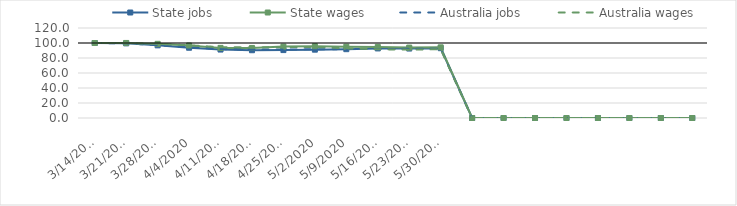
| Category | State jobs | State wages | Australia jobs | Australia wages |
|---|---|---|---|---|
| 14/03/2020 | 100 | 100 | 100 | 100 |
| 21/03/2020 | 99.502 | 100.082 | 99.552 | 99.902 |
| 28/03/2020 | 96.868 | 98.901 | 97.088 | 98.771 |
| 04/04/2020 | 93.669 | 96.728 | 94.15 | 97.007 |
| 11/04/2020 | 91.26 | 93.498 | 91.933 | 94.434 |
| 18/04/2020 | 90.36 | 93.376 | 91.108 | 94.115 |
| 25/04/2020 | 90.549 | 95.219 | 91.306 | 94.452 |
| 02/05/2020 | 91.109 | 95.774 | 91.63 | 94.778 |
| 09/05/2020 | 91.757 | 95.087 | 91.91 | 92.892 |
| 16/05/2020 | 92.759 | 94.805 | 92.165 | 91.712 |
| 23/05/2020 | 92.596 | 93.891 | 92.167 | 91.106 |
| 30/05/2020 | 93.078 | 94.221 | 92.546 | 91.708 |